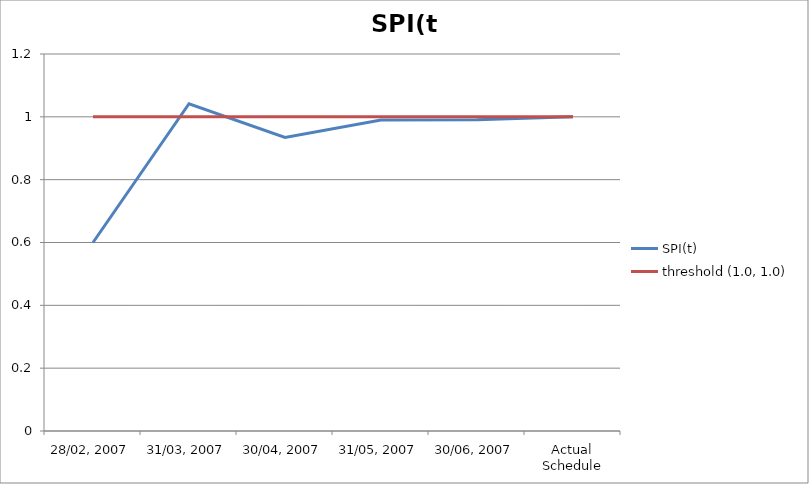
| Category | SPI(t) | threshold (1.0, 1.0) |
|---|---|---|
| 28/02, 2007 | 0.6 | 1 |
| 31/03, 2007 | 1.042 | 1 |
| 30/04, 2007 | 0.935 | 1 |
| 31/05, 2007 | 0.99 | 1 |
| 30/06, 2007 | 0.991 | 1 |
| Actual Schedule | 1 | 1 |